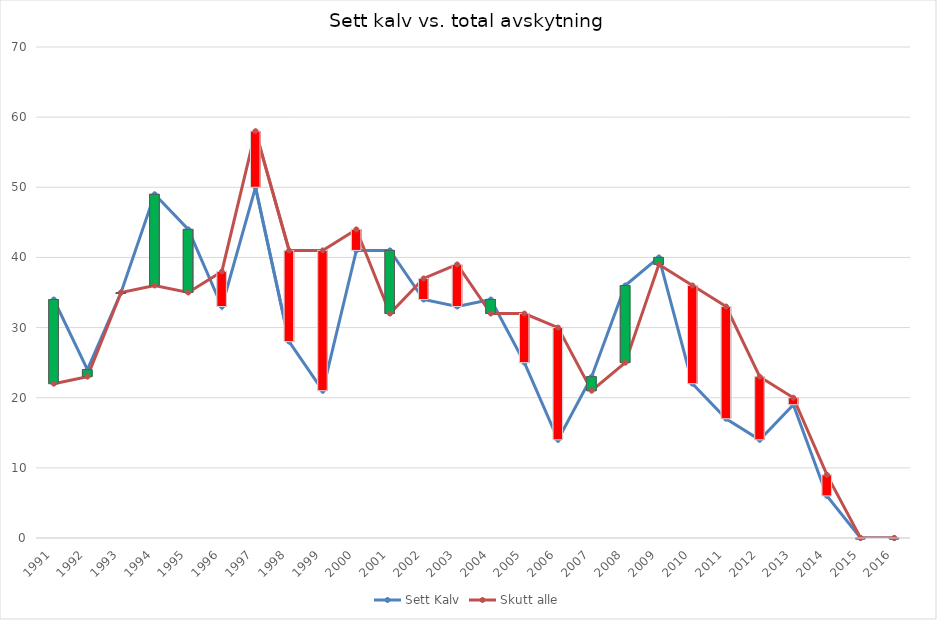
| Category | Sett Kalv | Skutt alle |
|---|---|---|
| 1991.0 | 34 | 22 |
| 1992.0 | 24 | 23 |
| 1993.0 | 35 | 35 |
| 1994.0 | 49 | 36 |
| 1995.0 | 44 | 35 |
| 1996.0 | 33 | 38 |
| 1997.0 | 50 | 58 |
| 1998.0 | 28 | 41 |
| 1999.0 | 21 | 41 |
| 2000.0 | 41 | 44 |
| 2001.0 | 41 | 32 |
| 2002.0 | 34 | 37 |
| 2003.0 | 33 | 39 |
| 2004.0 | 34 | 32 |
| 2005.0 | 25 | 32 |
| 2006.0 | 14 | 30 |
| 2007.0 | 23 | 21 |
| 2008.0 | 36 | 25 |
| 2009.0 | 40 | 39 |
| 2010.0 | 22 | 36 |
| 2011.0 | 17 | 33 |
| 2012.0 | 14 | 23 |
| 2013.0 | 19 | 20 |
| 2014.0 | 6 | 9 |
| 2015.0 | 0 | 0 |
| 2016.0 | 0 | 0 |